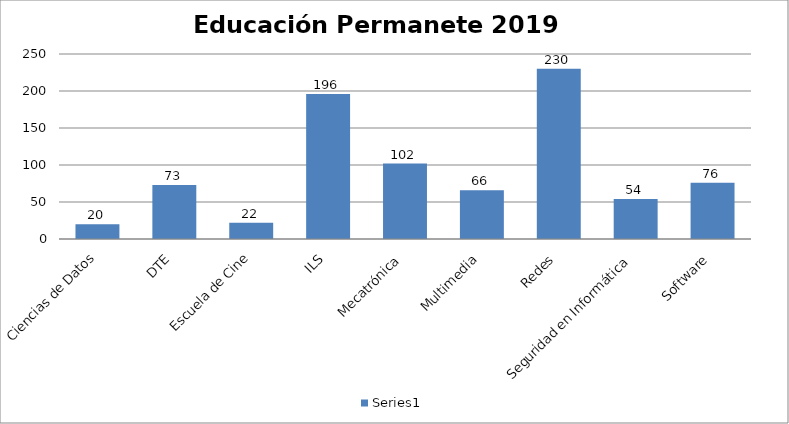
| Category | Series 0 |
|---|---|
| Ciencias de Datos | 20 |
| DTE | 73 |
| Escuela de Cine | 22 |
| ILS | 196 |
| Mecatrónica | 102 |
| Multimedia | 66 |
| Redes | 230 |
| Seguridad en Informática | 54 |
| Software | 76 |